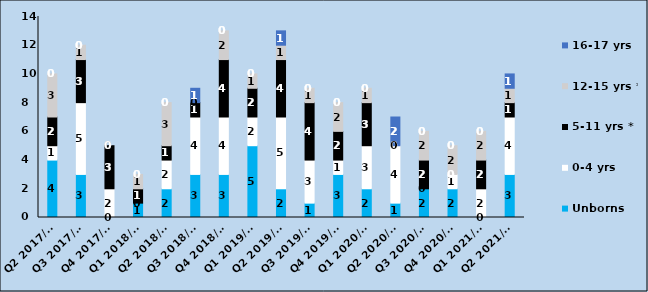
| Category | Unborns | 0-4 yrs | 5-11 yrs * | 12-15 yrs * | 16-17 yrs |
|---|---|---|---|---|---|
| Q2 2017/18 | 4 | 1 | 2 | 3 | 0 |
| Q3 2017/18 | 3 | 5 | 3 | 1 | 0 |
| Q4 2017/18 | 0 | 2 | 3 | 0 | 0 |
| Q1 2018/19 | 1 | 0 | 1 | 1 | 0 |
| Q2 2018/19 | 2 | 2 | 1 | 3 | 0 |
| Q3 2018/19 | 3 | 4 | 1 | 0 | 1 |
| Q4 2018/19 | 3 | 4 | 4 | 2 | 0 |
| Q1 2019/20 | 5 | 2 | 2 | 1 | 0 |
| Q2 2019/20 | 2 | 5 | 4 | 1 | 1 |
| Q3 2019/20 | 1 | 3 | 4 | 1 | 0 |
| Q4 2019/20 | 3 | 1 | 2 | 2 | 0 |
| Q1 2020/21 | 2 | 3 | 3 | 1 | 0 |
| Q2 2020/21 | 1 | 4 | 0 | 0 | 2 |
| Q3 2020/21 | 2 | 0 | 2 | 2 | 0 |
| Q4 2020/21 | 2 | 1 | 0 | 2 | 0 |
| Q1 2021/22 | 0 | 2 | 2 | 2 | 0 |
| Q2 2021/22 | 3 | 4 | 1 | 1 | 1 |